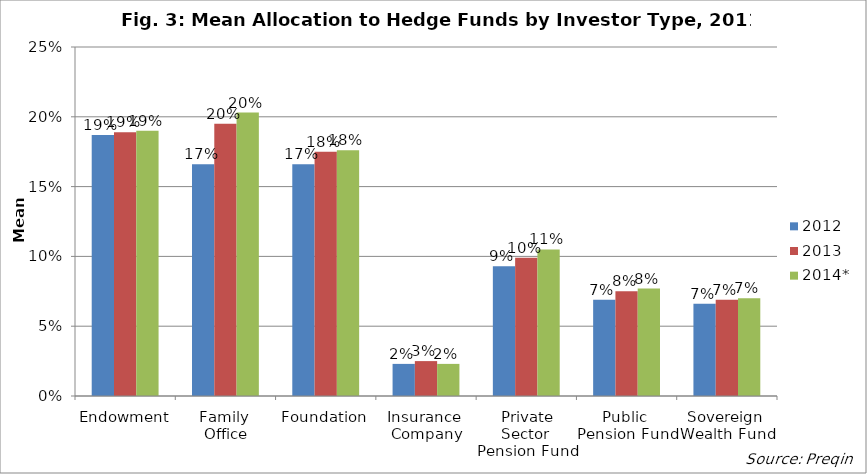
| Category | 2012 | 2013 | 2014* |
|---|---|---|---|
| Endowment | 0.187 | 0.189 | 0.19 |
| Family 
Office | 0.166 | 0.195 | 0.203 |
| Foundation | 0.166 | 0.175 | 0.176 |
| Insurance 
Company | 0.023 | 0.025 | 0.023 |
| Private Sector 
Pension Fund | 0.093 | 0.099 | 0.105 |
| Public 
Pension Fund | 0.069 | 0.075 | 0.077 |
| Sovereign 
Wealth Fund | 0.066 | 0.069 | 0.07 |